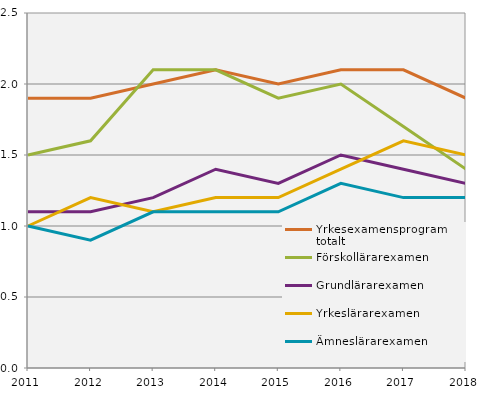
| Category | Yrkesexamensprogram totalt | Förskollärarexamen                                 | Grundlärarexamen                                   | Yrkeslärarexamen                                   | Ämneslärarexamen                                   |
|---|---|---|---|---|---|
| 2011.0 | 1.9 | 1.5 | 1.1 | 1 | 1 |
| 2012.0 | 1.9 | 1.6 | 1.1 | 1.2 | 0.9 |
| 2013.0 | 2 | 2.1 | 1.2 | 1.1 | 1.1 |
| 2014.0 | 2.1 | 2.1 | 1.4 | 1.2 | 1.1 |
| 2015.0 | 2 | 1.9 | 1.3 | 1.2 | 1.1 |
| 2016.0 | 2.1 | 2 | 1.5 | 1.4 | 1.3 |
| 2017.0 | 2.1 | 1.7 | 1.4 | 1.6 | 1.2 |
| 2018.0 | 1.9 | 1.4 | 1.3 | 1.5 | 1.2 |